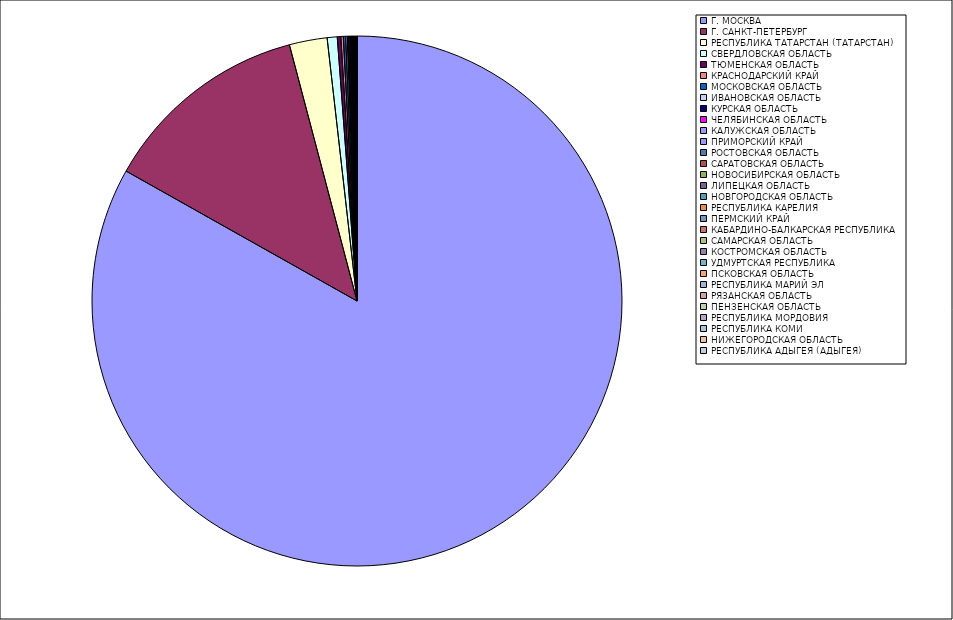
| Category | Оборот |
|---|---|
| Г. МОСКВА | 83.086 |
| Г. САНКТ-ПЕТЕРБУРГ | 12.727 |
| РЕСПУБЛИКА ТАТАРСТАН (ТАТАРСТАН) | 2.303 |
| СВЕРДЛОВСКАЯ ОБЛАСТЬ | 0.613 |
| ТЮМЕНСКАЯ ОБЛАСТЬ | 0.215 |
| КРАСНОДАРСКИЙ КРАЙ | 0.149 |
| МОСКОВСКАЯ ОБЛАСТЬ | 0.141 |
| ИВАНОВСКАЯ ОБЛАСТЬ | 0.097 |
| КУРСКАЯ ОБЛАСТЬ | 0.081 |
| ЧЕЛЯБИНСКАЯ ОБЛАСТЬ | 0.067 |
| КАЛУЖСКАЯ ОБЛАСТЬ | 0.044 |
| ПРИМОРСКИЙ КРАЙ | 0.04 |
| РОСТОВСКАЯ ОБЛАСТЬ | 0.038 |
| САРАТОВСКАЯ ОБЛАСТЬ | 0.036 |
| НОВОСИБИРСКАЯ ОБЛАСТЬ | 0.027 |
| ЛИПЕЦКАЯ ОБЛАСТЬ | 0.023 |
| НОВГОРОДСКАЯ ОБЛАСТЬ | 0.022 |
| РЕСПУБЛИКА КАРЕЛИЯ | 0.021 |
| ПЕРМСКИЙ КРАЙ | 0.021 |
| КАБАРДИНО-БАЛКАРСКАЯ РЕСПУБЛИКА | 0.021 |
| САМАРСКАЯ ОБЛАСТЬ | 0.018 |
| КОСТРОМСКАЯ ОБЛАСТЬ | 0.017 |
| УДМУРТСКАЯ РЕСПУБЛИКА | 0.016 |
| ПСКОВСКАЯ ОБЛАСТЬ | 0.015 |
| РЕСПУБЛИКА МАРИЙ ЭЛ | 0.014 |
| РЯЗАНСКАЯ ОБЛАСТЬ | 0.014 |
| ПЕНЗЕНСКАЯ ОБЛАСТЬ | 0.013 |
| РЕСПУБЛИКА МОРДОВИЯ | 0.013 |
| РЕСПУБЛИКА КОМИ | 0.012 |
| НИЖЕГОРОДСКАЯ ОБЛАСТЬ | 0.012 |
| РЕСПУБЛИКА АДЫГЕЯ (АДЫГЕЯ) | 0 |